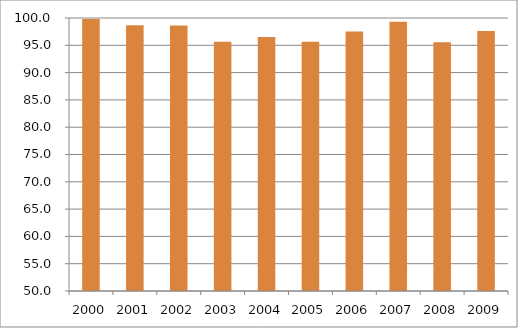
| Category | Região Sudeste |
|---|---|
| 2000.0 | 99.82 |
| 2001.0 | 98.65 |
| 2002.0 | 98.64 |
| 2003.0 | 95.67 |
| 2004.0 | 96.51 |
| 2005.0 | 95.63 |
| 2006.0 | 97.52 |
| 2007.0 | 99.32 |
| 2008.0 | 95.55 |
| 2009.0 | 97.61 |